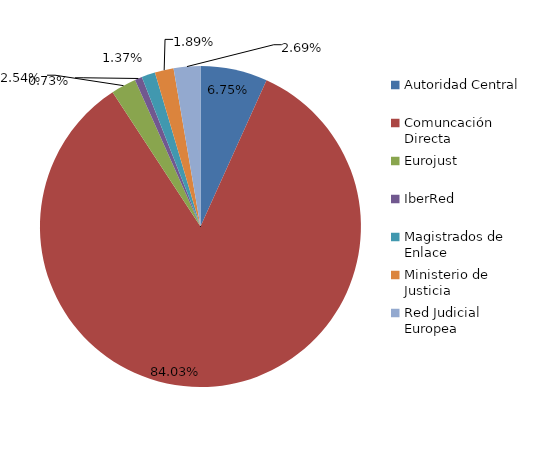
| Category | Series 0 |
|---|---|
| Autoridad Central | 221 |
| Comuncación Directa | 2751 |
| Eurojust | 83 |
| IberRed | 24 |
| Magistrados de Enlace | 45 |
| Ministerio de Justicia | 62 |
| Red Judicial Europea | 88 |